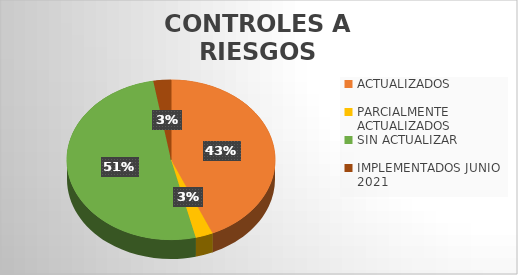
| Category | Series 0 |
|---|---|
| ACTUALIZADOS | 80 |
| PARCIALMENTE ACTUALIZADOS | 5 |
| SIN ACTUALIZAR | 94 |
| IMPLEMENTADOS JUNIO 2021 | 5 |